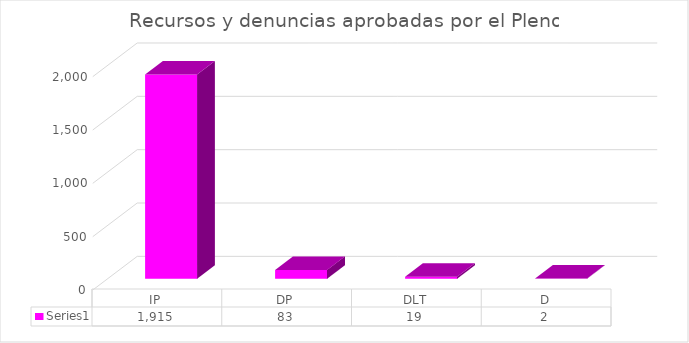
| Category | Series 0 |
|---|---|
| IP | 1915 |
| DP | 83 |
| DLT | 19 |
| D | 2 |